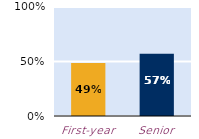
| Category | frequently |
|---|---|
| First-year | 0.485 |
| Senior | 0.572 |